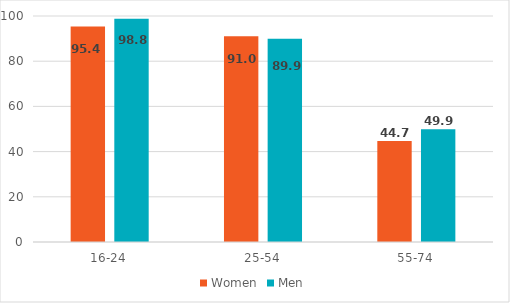
| Category | Women | Men |
|---|---|---|
| 16-24 | 95.4 | 98.8 |
| 25-54 | 91 | 89.9 |
| 55-74 | 44.7 | 49.9 |